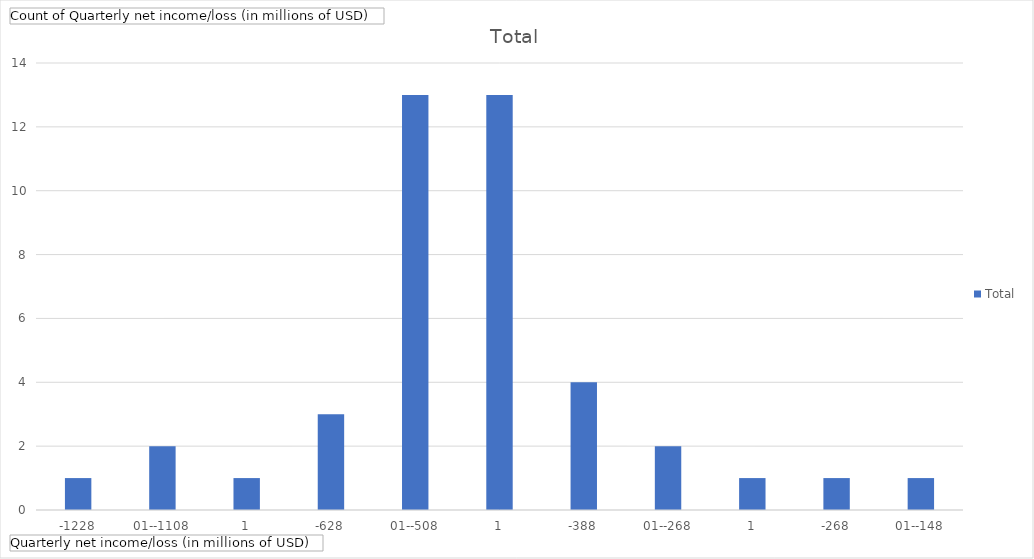
| Category | Total |
|---|---|
| -1228,01--1108,01 | 1 |
| -628,01--508,01 | 2 |
| -388,01--268,01 | 1 |
| -268,01--148,01 | 3 |
| -148,01--28,01 | 13 |
| -28,01-91,99 | 13 |
| 91,99-211,99 | 4 |
| 211,99-331,99 | 2 |
| 451,99-571,99 | 1 |
| 691,99-811,99 | 1 |
| 1051,99-1171,99 | 1 |